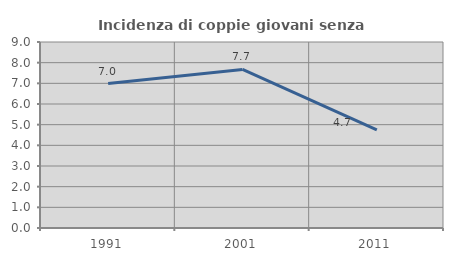
| Category | Incidenza di coppie giovani senza figli |
|---|---|
| 1991.0 | 6.987 |
| 2001.0 | 7.674 |
| 2011.0 | 4.745 |